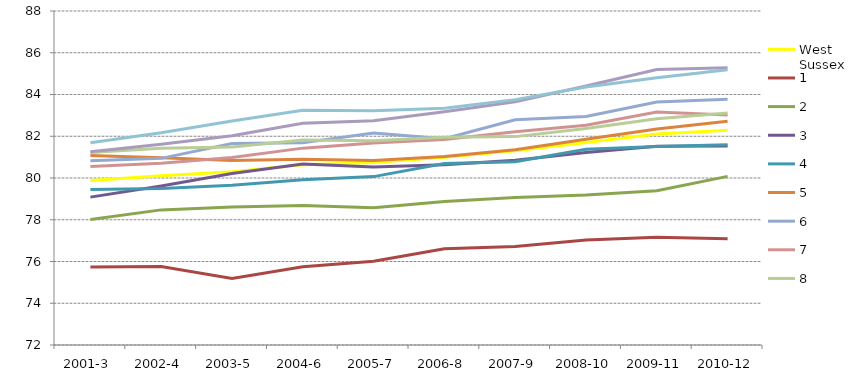
| Category | West Sussex | 1 | 2 | 3 | 4 | 5 | 6 | 7 | 8 | 9 | 10 |
|---|---|---|---|---|---|---|---|---|---|---|---|
| 2001-3 | 79.883 | 75.742 | 78.008 | 79.084 | 79.452 | 81.081 | 80.826 | 80.548 | 81.217 | 81.258 | 81.687 |
| 2002-4 | 80.104 | 75.764 | 78.473 | 79.613 | 79.501 | 80.966 | 80.94 | 80.711 | 81.43 | 81.622 | 82.172 |
| 2003-5 | 80.299 | 75.186 | 78.613 | 80.217 | 79.653 | 80.838 | 81.648 | 80.978 | 81.486 | 82.026 | 82.734 |
| 2004-6 | 80.636 | 75.751 | 78.681 | 80.668 | 79.919 | 80.893 | 81.692 | 81.431 | 81.816 | 82.628 | 83.244 |
| 2005-7 | 80.738 | 76.014 | 78.572 | 80.523 | 80.066 | 80.836 | 82.152 | 81.676 | 81.785 | 82.74 | 83.22 |
| 2006-8 | 80.998 | 76.611 | 78.876 | 80.638 | 80.695 | 81.029 | 81.886 | 81.849 | 81.95 | 83.174 | 83.345 |
| 2007-9 | 81.302 | 76.715 | 79.066 | 80.85 | 80.783 | 81.349 | 82.786 | 82.217 | 81.982 | 83.656 | 83.755 |
| 2008-10 | 81.7 | 77.035 | 79.185 | 81.224 | 81.374 | 81.854 | 82.948 | 82.53 | 82.375 | 84.407 | 84.36 |
| 2009-11 | 82.107 | 77.159 | 79.389 | 81.52 | 81.507 | 82.344 | 83.639 | 83.157 | 82.836 | 85.2 | 84.8 |
| 2010-12 | 82.285 | 77.09 | 80.078 | 81.529 | 81.59 | 82.72 | 83.774 | 83.019 | 83.113 | 85.286 | 85.19 |